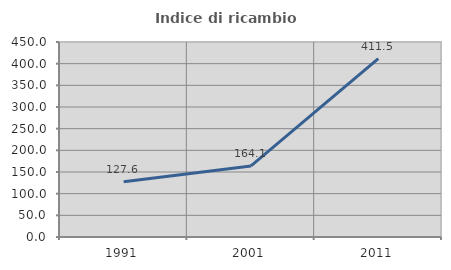
| Category | Indice di ricambio occupazionale  |
|---|---|
| 1991.0 | 127.55 |
| 2001.0 | 164.072 |
| 2011.0 | 411.484 |